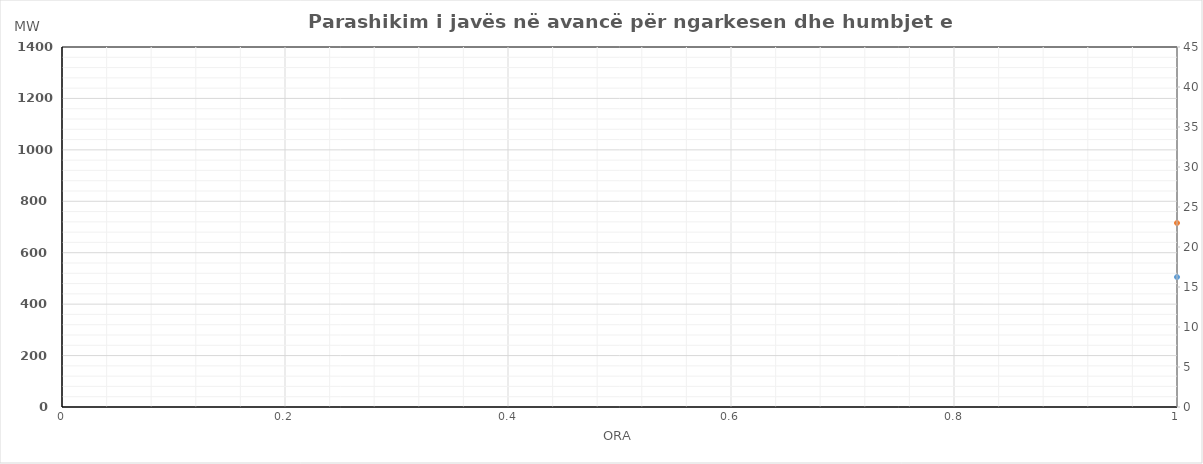
| Category | Ngarkesa (MWh) |
|---|---|
| 0 | 715.6 |
| 1 | 649.52 |
| 2 | 613.16 |
| 3 | 592.48 |
| 4 | 584.98 |
| 5 | 622.76 |
| 6 | 698.62 |
| 7 | 813.51 |
| 8 | 914.02 |
| 9 | 960.12 |
| 10 | 972.7 |
| 11 | 972.12 |
| 12 | 995.29 |
| 13 | 1009.78 |
| 14 | 1001.25 |
| 15 | 1031.36 |
| 16 | 1035.09 |
| 17 | 1051.12 |
| 18 | 1069.99 |
| 19 | 1064.39 |
| 20 | 1083.36 |
| 21 | 1059.06 |
| 22 | 967.13 |
| 23 | 830.61 |
| 24 | 727.17 |
| 25 | 658.29 |
| 26 | 621.48 |
| 27 | 601.85 |
| 28 | 598.04 |
| 29 | 623.23 |
| 30 | 715.5 |
| 31 | 837.08 |
| 32 | 936.33 |
| 33 | 984.65 |
| 34 | 1015.74 |
| 35 | 1037.65 |
| 36 | 1062.45 |
| 37 | 1074.46 |
| 38 | 1057.24 |
| 39 | 1052.86 |
| 40 | 1051.32 |
| 41 | 1073.52 |
| 42 | 1092.93 |
| 43 | 1087.74 |
| 44 | 1105.57 |
| 45 | 1086.77 |
| 46 | 984.67 |
| 47 | 850.11 |
| 48 | 749.13 |
| 49 | 680.29 |
| 50 | 642.48 |
| 51 | 621.98 |
| 52 | 617.56 |
| 53 | 637.92 |
| 54 | 726.27 |
| 55 | 852.99 |
| 56 | 952.55 |
| 57 | 1000.35 |
| 58 | 1006.99 |
| 59 | 1016.18 |
| 60 | 1029.12 |
| 61 | 1072.6 |
| 62 | 1060.16 |
| 63 | 1039.16 |
| 64 | 1058.27 |
| 65 | 1077.27 |
| 66 | 1095.89 |
| 67 | 1101.89 |
| 68 | 1120.34 |
| 69 | 1097.95 |
| 70 | 992.26 |
| 71 | 859.3 |
| 72 | 734.47 |
| 73 | 663.63 |
| 74 | 624.12 |
| 75 | 606.44 |
| 76 | 604.6 |
| 77 | 633.89 |
| 78 | 728.01 |
| 79 | 854.07 |
| 80 | 956.65 |
| 81 | 1006.09 |
| 82 | 1025.16 |
| 83 | 1050.16 |
| 84 | 1071.6 |
| 85 | 1091.28 |
| 86 | 1081.41 |
| 87 | 1069.27 |
| 88 | 1065.15 |
| 89 | 1092.9 |
| 90 | 1114.49 |
| 91 | 1120.6 |
| 92 | 1152.75 |
| 93 | 1112.05 |
| 94 | 1000.6 |
| 95 | 866.25 |
| 96 | 733.47 |
| 97 | 663.73 |
| 98 | 626.22 |
| 99 | 606.74 |
| 100 | 605.2 |
| 101 | 639.39 |
| 102 | 731.51 |
| 103 | 854.67 |
| 104 | 961.65 |
| 105 | 1006.49 |
| 106 | 1020.76 |
| 107 | 1065.76 |
| 108 | 1087.2 |
| 109 | 1098.18 |
| 110 | 1067.31 |
| 111 | 1055.97 |
| 112 | 1054.75 |
| 113 | 1082.7 |
| 114 | 1108.49 |
| 115 | 1111.6 |
| 116 | 1145.95 |
| 117 | 1108.25 |
| 118 | 1000.9 |
| 119 | 862.35 |
| 120 | 734.99 |
| 121 | 670.29 |
| 122 | 633.77 |
| 123 | 616.48 |
| 124 | 617.15 |
| 125 | 650.38 |
| 126 | 741.45 |
| 127 | 864.76 |
| 128 | 959.26 |
| 129 | 1000.56 |
| 130 | 1016.35 |
| 131 | 1028.41 |
| 132 | 1018.74 |
| 133 | 1031.31 |
| 134 | 958.08 |
| 135 | 932.44 |
| 136 | 905.91 |
| 137 | 939.01 |
| 138 | 977.36 |
| 139 | 993.76 |
| 140 | 1022.24 |
| 141 | 993.33 |
| 142 | 798.82 |
| 143 | 693.8 |
| 144 | 686.19 |
| 145 | 622.89 |
| 146 | 591.47 |
| 147 | 574.58 |
| 148 | 571.55 |
| 149 | 590.88 |
| 150 | 648.95 |
| 151 | 737.46 |
| 152 | 821.16 |
| 153 | 852.06 |
| 154 | 821.45 |
| 155 | 838.31 |
| 156 | 848.04 |
| 157 | 839.31 |
| 158 | 804.53 |
| 159 | 801.09 |
| 160 | 820.86 |
| 161 | 862.46 |
| 162 | 931.91 |
| 163 | 966.21 |
| 164 | 1010.69 |
| 165 | 1009.38 |
| 166 | 896.52 |
| 167 | 761.8 |